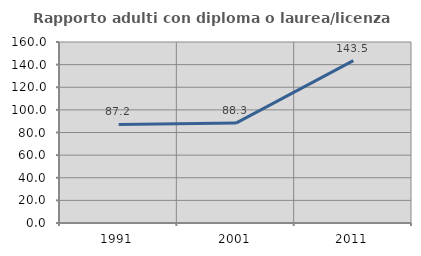
| Category | Rapporto adulti con diploma o laurea/licenza media  |
|---|---|
| 1991.0 | 87.179 |
| 2001.0 | 88.298 |
| 2011.0 | 143.478 |